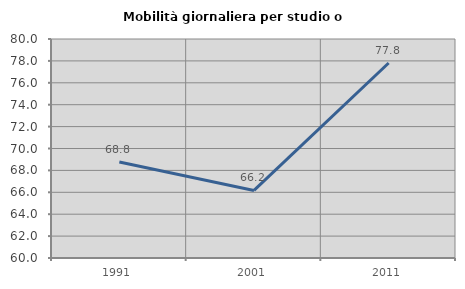
| Category | Mobilità giornaliera per studio o lavoro |
|---|---|
| 1991.0 | 68.767 |
| 2001.0 | 66.171 |
| 2011.0 | 77.808 |